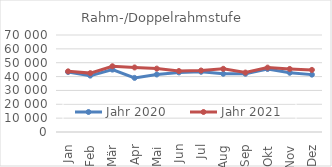
| Category | Jahr 2020 | Jahr 2021 |
|---|---|---|
| 0 | 43310.632 | 43772.739 |
| 1 | 40698.936 | 42495.779 |
| 2 | 45009.862 | 47438.808 |
| 3 | 39053.389 | 46573.412 |
| 4 | 41513.626 | 45742.508 |
| 5 | 43011.102 | 44003.651 |
| 6 | 43460.653 | 44367.088 |
| 7 | 42020.607 | 45595.612 |
| 8 | 42011.468 | 42888.157 |
| 9 | 45442.994 | 46464.581 |
| 10 | 42752.212 | 45506.419 |
| 11 | 41403.969 | 44819.746 |